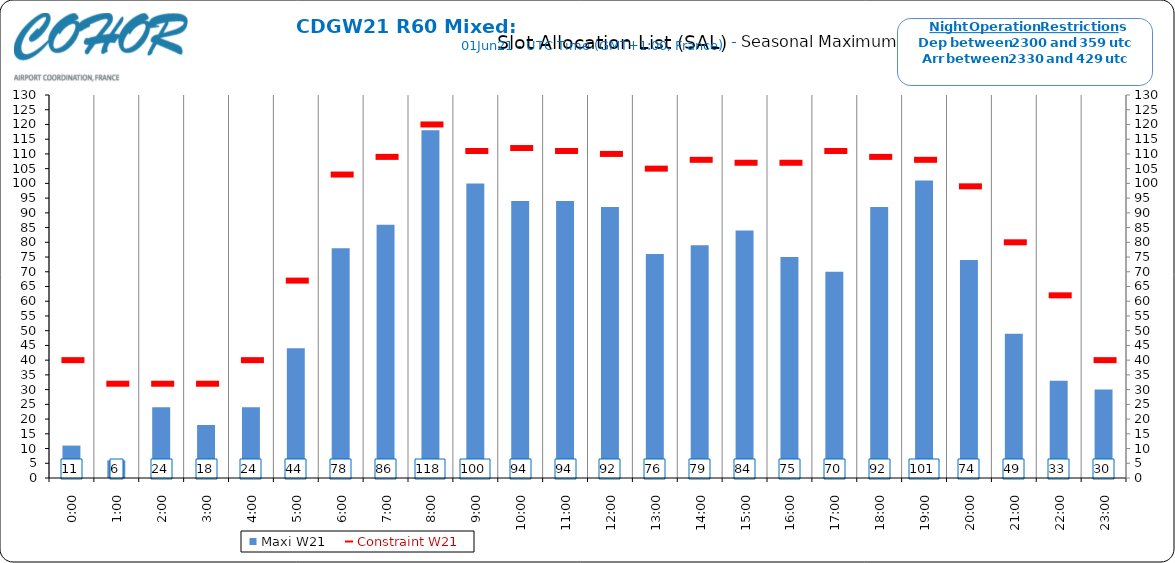
| Category | Maxi W21 |
|---|---|
| 0:00 | 11 |
| 1:00 | 6 |
| 2:00 | 24 |
| 3:00 | 18 |
| 4:00 | 24 |
| 5:00 | 44 |
| 6:00 | 78 |
| 7:00 | 86 |
| 8:00 | 118 |
| 9:00 | 100 |
| 10:00 | 94 |
| 11:00 | 94 |
| 12:00 | 92 |
| 13:00 | 76 |
| 14:00 | 79 |
| 15:00 | 84 |
| 16:00 | 75 |
| 17:00 | 70 |
| 18:00 | 92 |
| 19:00 | 101 |
| 20:00 | 74 |
| 21:00 | 49 |
| 22:00 | 33 |
| 23:00 | 30 |